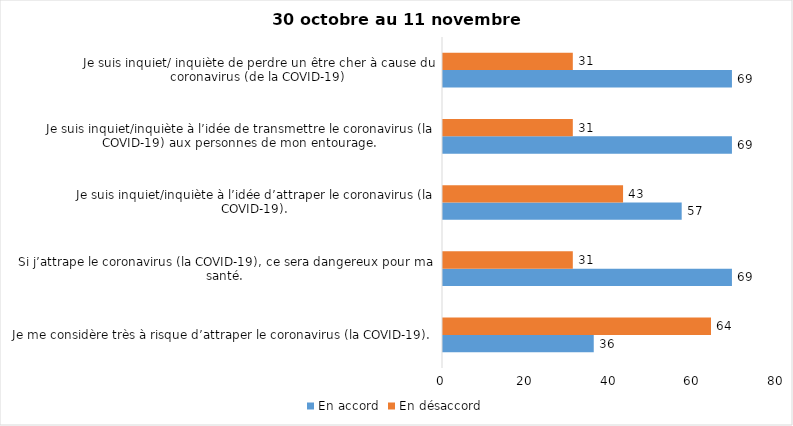
| Category | En accord | En désaccord |
|---|---|---|
| Je me considère très à risque d’attraper le coronavirus (la COVID-19). | 36 | 64 |
| Si j’attrape le coronavirus (la COVID-19), ce sera dangereux pour ma santé. | 69 | 31 |
| Je suis inquiet/inquiète à l’idée d’attraper le coronavirus (la COVID-19). | 57 | 43 |
| Je suis inquiet/inquiète à l’idée de transmettre le coronavirus (la COVID-19) aux personnes de mon entourage. | 69 | 31 |
| Je suis inquiet/ inquiète de perdre un être cher à cause du coronavirus (de la COVID-19) | 69 | 31 |